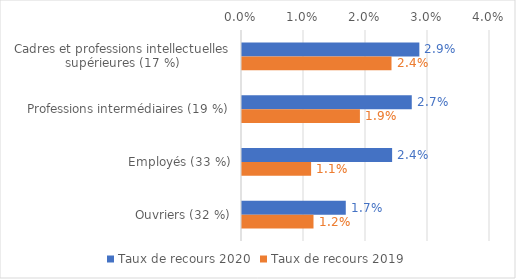
| Category | Taux de recours 2020 | Taux de recours 2019 |
|---|---|---|
| Cadres et professions intellectuelles supérieures (17 %) | 0.029 | 0.024 |
| Professions intermédiaires (19 %) | 0.027 | 0.019 |
| Employés (33 %) | 0.024 | 0.011 |
| Ouvriers (32 %) | 0.017 | 0.012 |